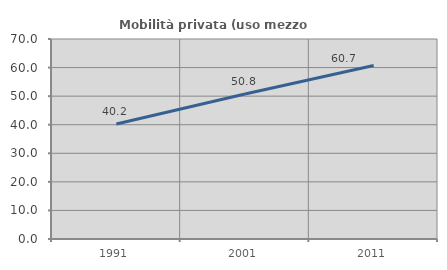
| Category | Mobilità privata (uso mezzo privato) |
|---|---|
| 1991.0 | 40.247 |
| 2001.0 | 50.768 |
| 2011.0 | 60.749 |